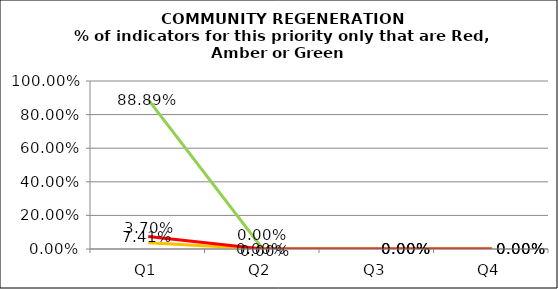
| Category | Green | Amber | Red |
|---|---|---|---|
| Q1 | 0.889 | 0.037 | 0.074 |
| Q2 | 0 | 0 | 0 |
| Q3 | 0 | 0 | 0 |
| Q4 | 0 | 0 | 0 |